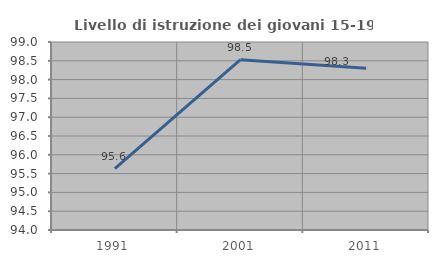
| Category | Livello di istruzione dei giovani 15-19 anni |
|---|---|
| 1991.0 | 95.631 |
| 2001.0 | 98.529 |
| 2011.0 | 98.305 |